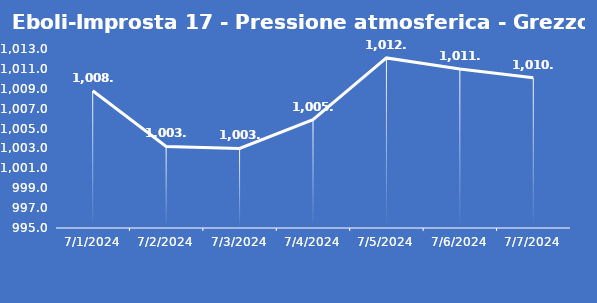
| Category | Eboli-Improsta 17 - Pressione atmosferica - Grezzo (hPa) |
|---|---|
| 7/1/24 | 1008.8 |
| 7/2/24 | 1003.2 |
| 7/3/24 | 1003 |
| 7/4/24 | 1005.9 |
| 7/5/24 | 1012.1 |
| 7/6/24 | 1011 |
| 7/7/24 | 1010.1 |